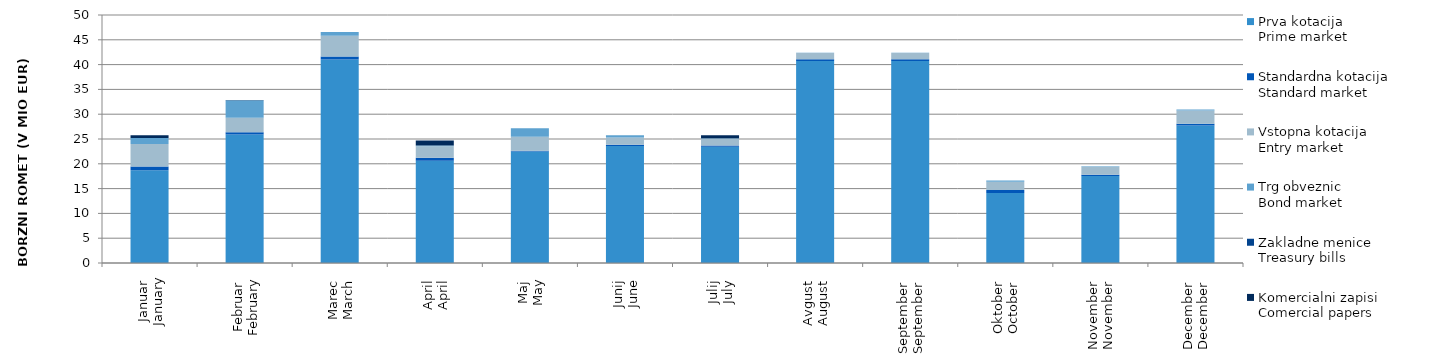
| Category | Prva kotacija
Prime market | Standardna kotacija
Standard market | Vstopna kotacija
Entry market | Trg obveznic
Bond market | Zakladne menice
Treasury bills | Komercialni zapisi
Comercial papers |
|---|---|---|---|---|---|---|
| Januar
January | 18.702 | 0.77 | 4.523 | 1.199 | 0 | 0.548 |
| Februar
February | 25.89 | 0.493 | 2.89 | 3.554 | 0 | 0.037 |
| Marec
March | 41.032 | 0.619 | 4.167 | 0.779 | 0 | 0 |
| April
April | 20.61 | 0.588 | 2.361 | 0.127 | 0 | 0.994 |
| Maj
May | 22.492 | 0.138 | 2.834 | 1.704 | 0 | 0 |
| Junij
June | 23.584 | 0.244 | 1.475 | 0.45 | 0 | 0 |
| Julij
July | 23.433 | 0.256 | 1.376 | 0.084 | 0 | 0.628 |
| Avgust
August | 40.732 | 0.327 | 1.282 | 0.046 | 0 | 0 |
| September
September | 40.732 | 0.327 | 1.282 | 0.046 | 0 | 0 |
| Oktober
October | 14.118 | 0.617 | 1.657 | 0.261 | 0 | 0 |
| November
November | 17.556 | 0.227 | 1.642 | 0.061 | 0 | 0 |
| December
December | 27.735 | 0.348 | 2.679 | 0.185 | 0 | 0 |